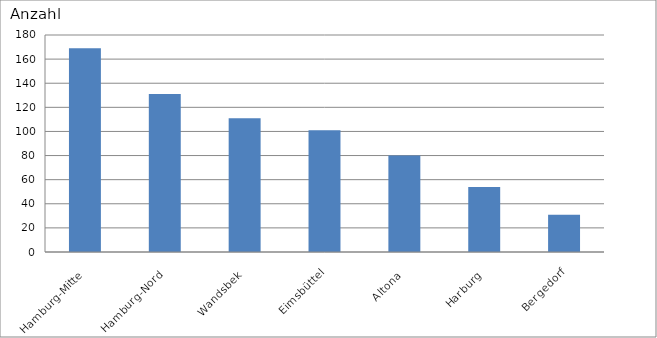
| Category | Hamburg-Mitte Hamburg-Nord Wandsbek Eimsbüttel Altona Harburg Bergedorf |
|---|---|
| Hamburg-Mitte | 169 |
| Hamburg-Nord | 131 |
| Wandsbek | 111 |
| Eimsbüttel | 101 |
| Altona | 80 |
| Harburg | 54 |
| Bergedorf | 31 |